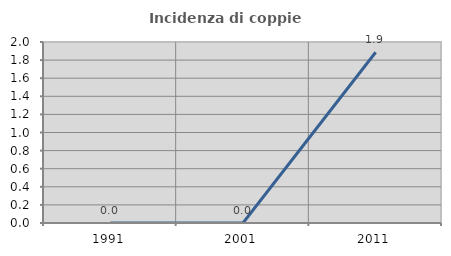
| Category | Incidenza di coppie miste |
|---|---|
| 1991.0 | 0 |
| 2001.0 | 0 |
| 2011.0 | 1.887 |